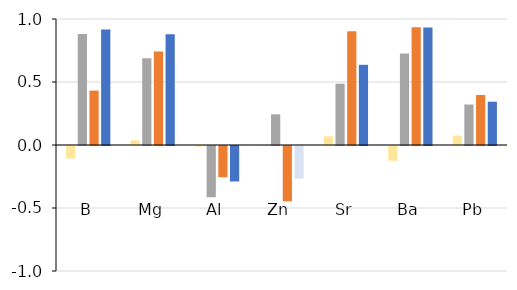
| Category | FO | IOM | ICE | GOM |
|---|---|---|---|---|
| B | -0.1 | 0.881 | 0.431 | 0.916 |
| Mg | 0.038 | 0.689 | 0.741 | 0.88 |
| Al | -0.005 | -0.407 | -0.248 | -0.282 |
| Zn | 0 | 0.243 | -0.439 | -0.259 |
| Sr | 0.07 | 0.486 | 0.903 | 0.637 |
| Ba | -0.117 | 0.726 | 0.935 | 0.932 |
| Pb | 0.074 | 0.321 | 0.397 | 0.344 |